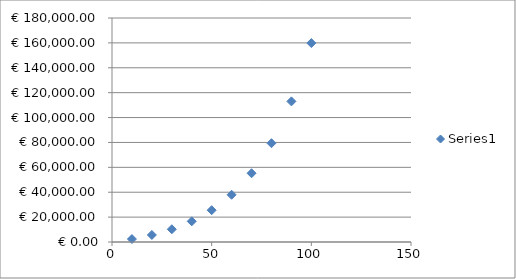
| Category | Series 0 |
|---|---|
| 10.0 | 2361.929 |
| 20.0 | 5653.643 |
| 30.0 | 10241.156 |
| 40.0 | 16634.565 |
| 50.0 | 25544.771 |
| 60.0 | 37962.523 |
| 70.0 | 55268.582 |
| 80.0 | 79387.256 |
| 90.0 | 113000.362 |
| 100.0 | 159845.429 |